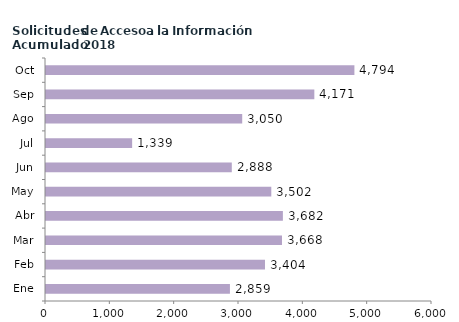
| Category | Series 0 |
|---|---|
| Ene | 2859 |
| Feb | 3404 |
| Mar | 3668 |
| Abr | 3682 |
| May | 3502 |
| Jun | 2888 |
| Jul | 1339 |
| Ago | 3050 |
| Sep | 4171 |
| Oct | 4794 |